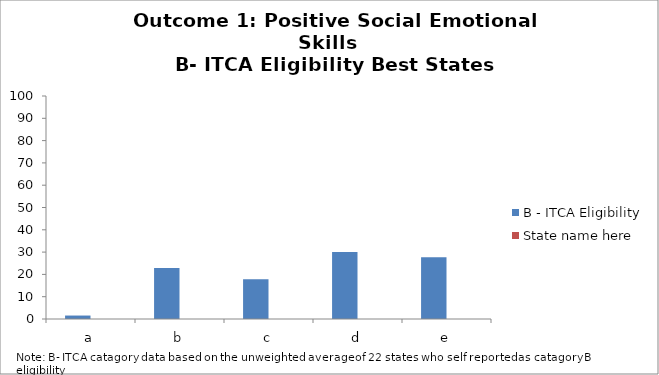
| Category | B - ITCA Eligibility | State name here |
|---|---|---|
| a | 1.55 |  |
| b | 22.9 |  |
| c | 17.8 |  |
| d | 30 |  |
| e | 27.7 |  |